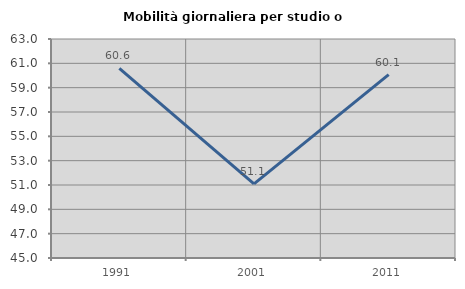
| Category | Mobilità giornaliera per studio o lavoro |
|---|---|
| 1991.0 | 60.579 |
| 2001.0 | 51.089 |
| 2011.0 | 60.074 |